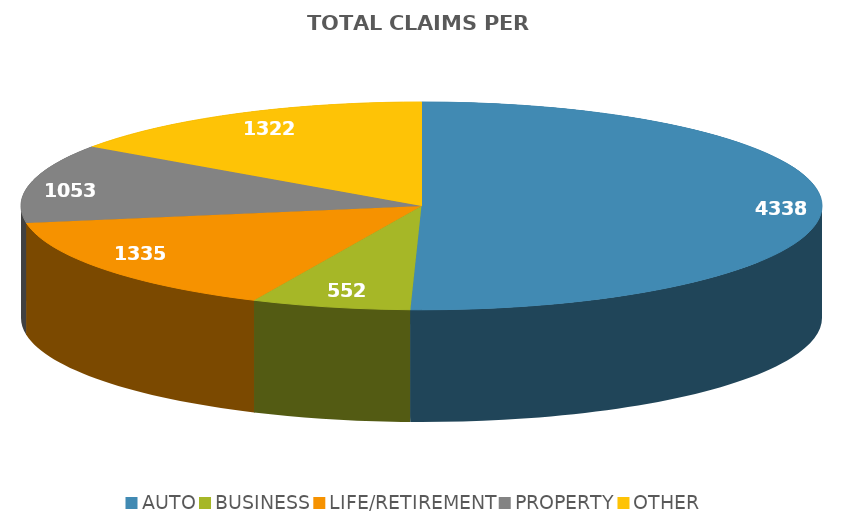
| Category | Series 0 |
|---|---|
| AUTO | 4338 |
| BUSINESS | 552 |
| LIFE/RETIREMENT | 1335 |
| PROPERTY | 1053 |
| OTHER | 1322 |